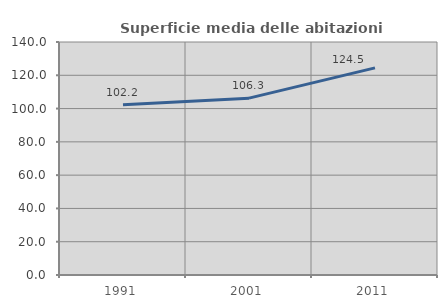
| Category | Superficie media delle abitazioni occupate |
|---|---|
| 1991.0 | 102.249 |
| 2001.0 | 106.255 |
| 2011.0 | 124.47 |